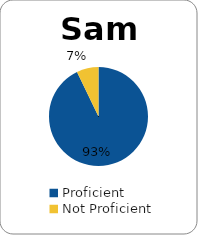
| Category | Series 0 |
|---|---|
| Proficient | 0.929 |
| Not Proficient | 0.071 |